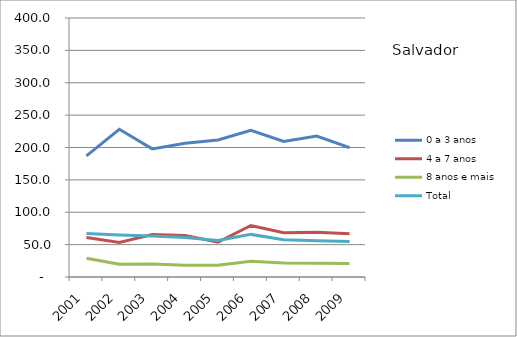
| Category | 0 a 3 anos | 4 a 7 anos | 8 anos e mais | Total |
|---|---|---|---|---|
| 2001.0 | 187 | 61 | 29.1 | 67 |
| 2002.0 | 228.2 | 53.2 | 19.8 | 64.9 |
| 2003.0 | 197.9 | 65.6 | 20.1 | 63.2 |
| 2004.0 | 206.6 | 64.2 | 18.2 | 61 |
| 2005.0 | 211.7 | 53.8 | 18 | 56.5 |
| 2006.0 | 226.4 | 79.6 | 24.3 | 65.8 |
| 2007.0 | 209.3 | 68.4 | 21.5 | 57.7 |
| 2008.0 | 217.6 | 69.1 | 21.1 | 55.9 |
| 2009.0 | 199.7 | 66.9 | 20.9 | 54.9 |